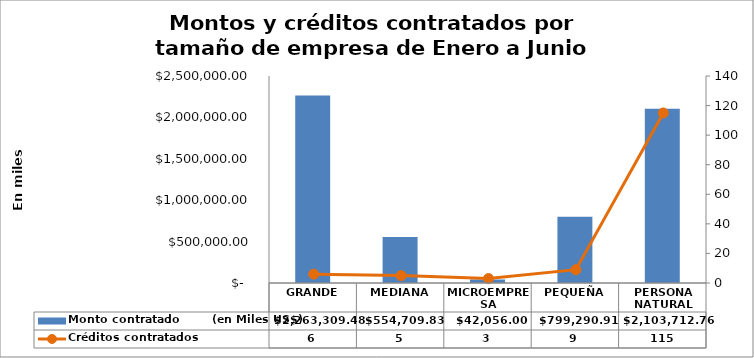
| Category | Monto contratado        (en Miles US$) |
|---|---|
| GRANDE | 2263309.48 |
| MEDIANA | 554709.83 |
| MICROEMPRESA | 42056 |
| PEQUEÑA | 799290.91 |
| PERSONA NATURAL | 2103712.76 |